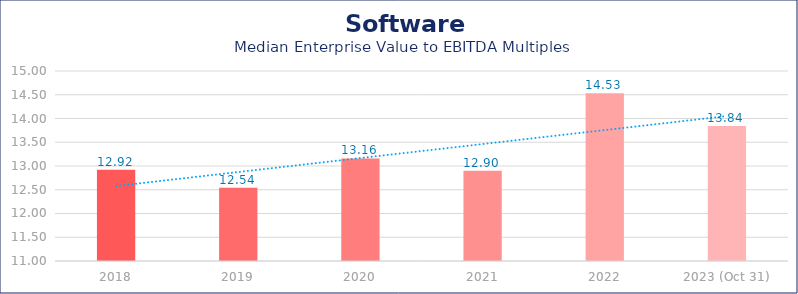
| Category | Software |
|---|---|
| 2018 | 12.92 |
| 2019 | 12.54 |
| 2020 | 13.16 |
| 2021 | 12.9 |
| 2022 | 14.53 |
| 2023 (Oct 31) | 13.84 |